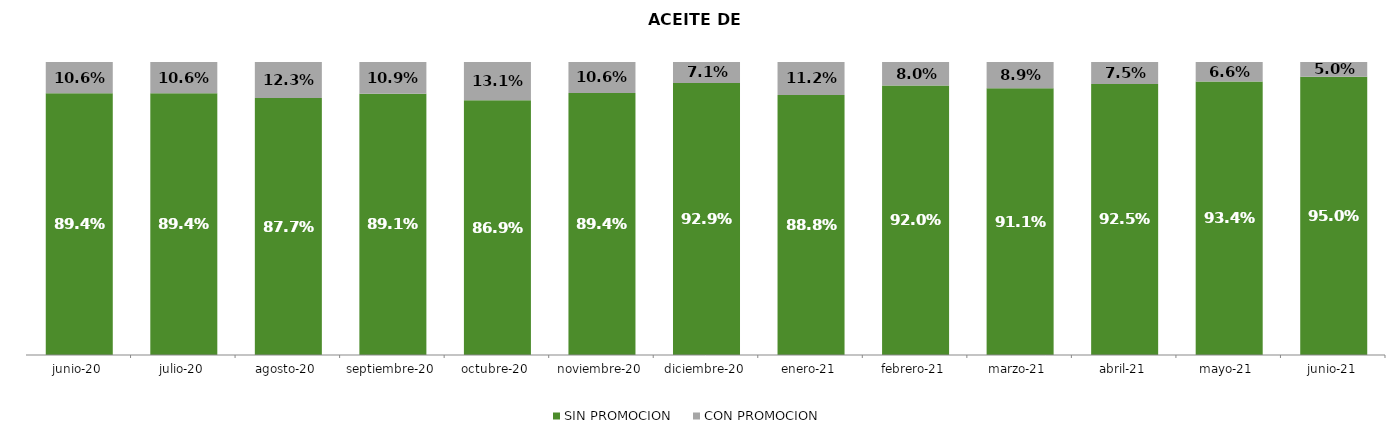
| Category | SIN PROMOCION   | CON PROMOCION   |
|---|---|---|
| 2020-06-01 | 0.894 | 0.106 |
| 2020-07-01 | 0.894 | 0.106 |
| 2020-08-01 | 0.877 | 0.123 |
| 2020-09-01 | 0.891 | 0.109 |
| 2020-10-01 | 0.869 | 0.131 |
| 2020-11-01 | 0.894 | 0.106 |
| 2020-12-01 | 0.929 | 0.071 |
| 2021-01-01 | 0.888 | 0.112 |
| 2021-02-01 | 0.92 | 0.08 |
| 2021-03-01 | 0.911 | 0.089 |
| 2021-04-01 | 0.925 | 0.075 |
| 2021-05-01 | 0.934 | 0.066 |
| 2021-06-01 | 0.95 | 0.05 |